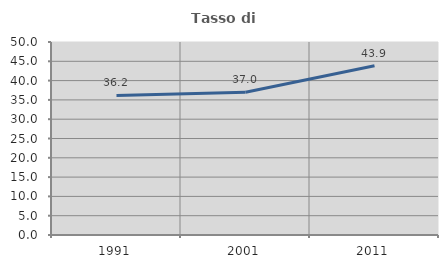
| Category | Tasso di occupazione   |
|---|---|
| 1991.0 | 36.17 |
| 2001.0 | 36.975 |
| 2011.0 | 43.86 |